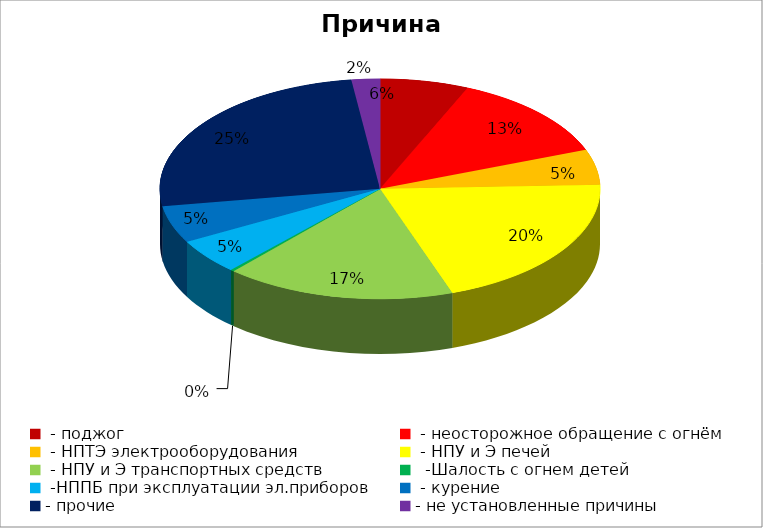
| Category | Причина пожара |
|---|---|
|  - поджог | 25 |
|  - неосторожное обращение с огнём | 49 |
|  - НПТЭ электрооборудования | 20 |
|  - НПУ и Э печей | 78 |
|  - НПУ и Э транспортных средств | 65 |
|   -Шалость с огнем детей | 1 |
|  -НППБ при эксплуатации эл.приборов | 20 |
|  - курение | 21 |
| - прочие | 98 |
| - не установленные причины | 8 |